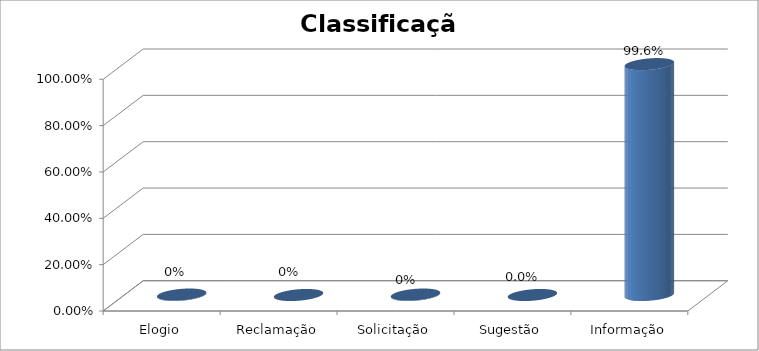
| Category | Series 0 |
|---|---|
| Elogio | 0.002 |
| Reclamação | 0 |
| Solicitação | 0.002 |
| Sugestão | 0 |
| Informação | 0.996 |